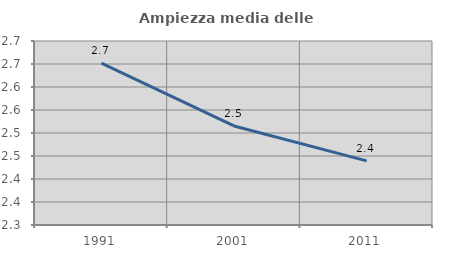
| Category | Ampiezza media delle famiglie |
|---|---|
| 1991.0 | 2.652 |
| 2001.0 | 2.515 |
| 2011.0 | 2.439 |